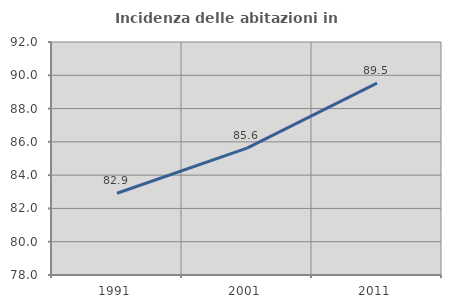
| Category | Incidenza delle abitazioni in proprietà  |
|---|---|
| 1991.0 | 82.911 |
| 2001.0 | 85.625 |
| 2011.0 | 89.529 |